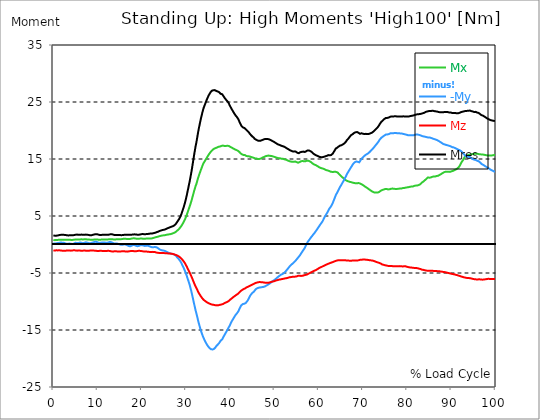
| Category |  Mx |  -My |  Mz |  Mres |
|---|---|---|---|---|
| 0.0 | 0.784 | 0.212 | -1.081 | 1.59 |
| 0.167348456675344 | 0.763 | 0.191 | -1.06 | 1.568 |
| 0.334696913350688 | 0.763 | 0.17 | -1.06 | 1.547 |
| 0.5020453700260321 | 0.763 | 0.191 | -1.038 | 1.547 |
| 0.669393826701376 | 0.784 | 0.212 | -1.017 | 1.547 |
| 0.83674228337672 | 0.805 | 0.254 | -1.017 | 1.568 |
| 1.0040907400520642 | 0.805 | 0.254 | -1.038 | 1.59 |
| 1.1621420602454444 | 0.827 | 0.254 | -1.017 | 1.611 |
| 1.3294905169207885 | 0.848 | 0.297 | -1.017 | 1.653 |
| 1.4968389735961325 | 0.848 | 0.318 | -1.038 | 1.674 |
| 1.6641874302714765 | 0.848 | 0.36 | -1.06 | 1.695 |
| 1.8315358869468206 | 0.848 | 0.339 | -1.081 | 1.717 |
| 1.9988843436221646 | 0.848 | 0.318 | -1.081 | 1.717 |
| 2.1662328002975086 | 0.848 | 0.318 | -1.081 | 1.717 |
| 2.333581256972853 | 0.848 | 0.318 | -1.081 | 1.695 |
| 2.5009297136481967 | 0.848 | 0.276 | -1.102 | 1.695 |
| 2.6682781703235405 | 0.827 | 0.212 | -1.102 | 1.674 |
| 2.8356266269988843 | 0.827 | 0.148 | -1.081 | 1.653 |
| 3.002975083674229 | 0.827 | 0.127 | -1.06 | 1.632 |
| 3.1703235403495724 | 0.827 | 0.127 | -1.038 | 1.611 |
| 3.337671997024917 | 0.827 | 0.148 | -1.038 | 1.59 |
| 3.4957233172182973 | 0.827 | 0.148 | -1.038 | 1.611 |
| 3.663071773893641 | 0.827 | 0.17 | -1.06 | 1.611 |
| 3.8304202305689854 | 0.827 | 0.148 | -1.081 | 1.632 |
| 3.997768687244329 | 0.805 | 0.127 | -1.081 | 1.632 |
| 4.165117143919673 | 0.805 | 0.085 | -1.06 | 1.632 |
| 4.332465600595017 | 0.805 | 0.085 | -1.038 | 1.611 |
| 4.499814057270361 | 0.827 | 0.106 | -1.017 | 1.632 |
| 4.667162513945706 | 0.848 | 0.17 | -1.017 | 1.653 |
| 4.834510970621049 | 0.869 | 0.254 | -1.017 | 1.695 |
| 5.001859427296393 | 0.869 | 0.297 | -1.038 | 1.717 |
| 5.169207883971737 | 0.869 | 0.297 | -1.06 | 1.738 |
| 5.336556340647081 | 0.869 | 0.276 | -1.081 | 1.738 |
| 5.503904797322425 | 0.869 | 0.276 | -1.081 | 1.738 |
| 5.671253253997769 | 0.869 | 0.254 | -1.06 | 1.717 |
| 5.82930457419115 | 0.869 | 0.276 | -1.06 | 1.695 |
| 5.996653030866494 | 0.89 | 0.339 | -1.06 | 1.717 |
| 6.164001487541838 | 0.911 | 0.36 | -1.081 | 1.738 |
| 6.331349944217181 | 0.911 | 0.318 | -1.102 | 1.738 |
| 6.498698400892526 | 0.89 | 0.254 | -1.102 | 1.717 |
| 6.66604685756787 | 0.89 | 0.233 | -1.081 | 1.695 |
| 6.833395314243213 | 0.89 | 0.254 | -1.06 | 1.695 |
| 7.000743770918558 | 0.911 | 0.297 | -1.06 | 1.695 |
| 7.168092227593902 | 0.911 | 0.36 | -1.06 | 1.717 |
| 7.335440684269246 | 0.911 | 0.381 | -1.081 | 1.738 |
| 7.50278914094459 | 0.911 | 0.381 | -1.102 | 1.738 |
| 7.6701375976199335 | 0.89 | 0.318 | -1.102 | 1.717 |
| 7.837486054295278 | 0.89 | 0.276 | -1.102 | 1.674 |
| 7.995537374488658 | 0.869 | 0.254 | -1.102 | 1.674 |
| 8.162885831164003 | 0.848 | 0.233 | -1.081 | 1.632 |
| 8.330234287839346 | 0.848 | 0.212 | -1.06 | 1.611 |
| 8.49758274451469 | 0.848 | 0.254 | -1.06 | 1.632 |
| 8.664931201190035 | 0.848 | 0.297 | -1.038 | 1.632 |
| 8.832279657865378 | 0.848 | 0.318 | -1.06 | 1.674 |
| 8.999628114540721 | 0.848 | 0.36 | -1.06 | 1.717 |
| 9.166976571216066 | 0.869 | 0.424 | -1.06 | 1.738 |
| 9.334325027891412 | 0.869 | 0.466 | -1.081 | 1.78 |
| 9.501673484566755 | 0.869 | 0.466 | -1.102 | 1.801 |
| 9.669021941242098 | 0.89 | 0.466 | -1.102 | 1.801 |
| 9.836370397917442 | 0.89 | 0.445 | -1.123 | 1.801 |
| 10.003718854592787 | 0.869 | 0.381 | -1.144 | 1.78 |
| 10.17106731126813 | 0.848 | 0.318 | -1.123 | 1.738 |
| 10.329118631461512 | 0.827 | 0.276 | -1.123 | 1.695 |
| 10.496467088136853 | 0.827 | 0.276 | -1.102 | 1.674 |
| 10.663815544812199 | 0.848 | 0.297 | -1.102 | 1.653 |
| 10.831164001487544 | 0.848 | 0.318 | -1.102 | 1.674 |
| 10.998512458162887 | 0.869 | 0.36 | -1.123 | 1.695 |
| 11.16586091483823 | 0.869 | 0.36 | -1.123 | 1.717 |
| 11.333209371513574 | 0.869 | 0.36 | -1.144 | 1.717 |
| 11.50055782818892 | 0.89 | 0.339 | -1.144 | 1.717 |
| 11.667906284864264 | 0.89 | 0.339 | -1.144 | 1.717 |
| 11.835254741539607 | 0.89 | 0.318 | -1.144 | 1.717 |
| 12.00260319821495 | 0.869 | 0.297 | -1.144 | 1.695 |
| 12.169951654890292 | 0.869 | 0.297 | -1.123 | 1.695 |
| 12.337300111565641 | 0.89 | 0.339 | -1.102 | 1.695 |
| 12.504648568240984 | 0.911 | 0.381 | -1.123 | 1.738 |
| 12.662699888434362 | 0.933 | 0.424 | -1.123 | 1.759 |
| 12.830048345109708 | 0.933 | 0.445 | -1.166 | 1.78 |
| 12.997396801785053 | 0.933 | 0.424 | -1.187 | 1.801 |
| 13.164745258460396 | 0.933 | 0.381 | -1.208 | 1.801 |
| 13.33209371513574 | 0.911 | 0.318 | -1.229 | 1.78 |
| 13.499442171811083 | 0.89 | 0.233 | -1.229 | 1.738 |
| 13.666790628486426 | 0.89 | 0.191 | -1.208 | 1.695 |
| 13.834139085161771 | 0.89 | 0.191 | -1.208 | 1.674 |
| 14.001487541837117 | 0.89 | 0.191 | -1.187 | 1.653 |
| 14.16883599851246 | 0.911 | 0.191 | -1.208 | 1.653 |
| 14.336184455187803 | 0.911 | 0.191 | -1.208 | 1.674 |
| 14.503532911863147 | 0.933 | 0.148 | -1.229 | 1.674 |
| 14.670881368538492 | 0.933 | 0.106 | -1.229 | 1.674 |
| 14.828932688731873 | 0.933 | 0.064 | -1.229 | 1.674 |
| 14.996281145407215 | 0.933 | 0.021 | -1.25 | 1.674 |
| 15.163629602082558 | 0.933 | -0.021 | -1.229 | 1.653 |
| 15.330978058757903 | 0.933 | -0.064 | -1.208 | 1.632 |
| 15.498326515433247 | 0.954 | -0.064 | -1.187 | 1.632 |
| 15.665674972108594 | 0.975 | -0.042 | -1.166 | 1.653 |
| 15.833023428783937 | 0.996 | 0 | -1.166 | 1.674 |
| 16.00037188545928 | 1.017 | 0.042 | -1.187 | 1.695 |
| 16.167720342134626 | 0.996 | 0.021 | -1.208 | 1.717 |
| 16.335068798809967 | 0.996 | -0.021 | -1.229 | 1.717 |
| 16.502417255485312 | 0.975 | -0.085 | -1.229 | 1.717 |
| 16.669765712160658 | 0.975 | -0.106 | -1.25 | 1.717 |
| 16.837114168836 | 0.975 | -0.191 | -1.229 | 1.717 |
| 17.004462625511344 | 0.975 | -0.254 | -1.208 | 1.695 |
| 17.16251394570472 | 0.975 | -0.297 | -1.187 | 1.695 |
| 17.32986240238007 | 0.975 | -0.318 | -1.166 | 1.695 |
| 17.497210859055414 | 0.996 | -0.276 | -1.144 | 1.695 |
| 17.664559315730756 | 1.038 | -0.212 | -1.144 | 1.717 |
| 17.8319077724061 | 1.06 | -0.148 | -1.144 | 1.738 |
| 17.999256229081443 | 1.081 | -0.085 | -1.144 | 1.759 |
| 18.166604685756788 | 1.081 | -0.085 | -1.166 | 1.759 |
| 18.333953142432133 | 1.081 | -0.106 | -1.187 | 1.78 |
| 18.501301599107478 | 1.06 | -0.148 | -1.187 | 1.78 |
| 18.668650055782823 | 1.038 | -0.212 | -1.187 | 1.759 |
| 18.835998512458165 | 1.017 | -0.254 | -1.166 | 1.738 |
| 19.00334696913351 | 0.996 | -0.297 | -1.144 | 1.717 |
| 19.170695425808855 | 0.996 | -0.297 | -1.102 | 1.717 |
| 19.338043882484197 | 1.017 | -0.254 | -1.102 | 1.717 |
| 19.496095202677576 | 1.017 | -0.191 | -1.102 | 1.738 |
| 19.66344365935292 | 1.038 | -0.127 | -1.123 | 1.759 |
| 19.830792116028263 | 1.038 | -0.085 | -1.144 | 1.78 |
| 19.998140572703612 | 1.038 | -0.106 | -1.166 | 1.823 |
| 20.165489029378953 | 1.038 | -0.127 | -1.208 | 1.823 |
| 20.3328374860543 | 1.017 | -0.17 | -1.208 | 1.823 |
| 20.500185942729644 | 1.017 | -0.212 | -1.208 | 1.801 |
| 20.667534399404985 | 1.017 | -0.254 | -1.208 | 1.801 |
| 20.83488285608033 | 1.017 | -0.233 | -1.208 | 1.801 |
| 21.002231312755672 | 1.038 | -0.212 | -1.229 | 1.823 |
| 21.16957976943102 | 1.038 | -0.191 | -1.25 | 1.844 |
| 21.336928226106362 | 1.038 | -0.191 | -1.272 | 1.844 |
| 21.504276682781704 | 1.038 | -0.233 | -1.293 | 1.865 |
| 21.67162513945705 | 1.038 | -0.297 | -1.293 | 1.886 |
| 21.82967645965043 | 1.06 | -0.339 | -1.314 | 1.929 |
| 21.997024916325774 | 1.06 | -0.403 | -1.314 | 1.929 |
| 22.16437337300112 | 1.06 | -0.445 | -1.314 | 1.929 |
| 22.33172182967646 | 1.081 | -0.487 | -1.293 | 1.929 |
| 22.499070286351806 | 1.123 | -0.466 | -1.314 | 1.95 |
| 22.666418743027148 | 1.166 | -0.466 | -1.314 | 1.992 |
| 22.833767199702496 | 1.208 | -0.445 | -1.314 | 2.035 |
| 23.00111565637784 | 1.25 | -0.445 | -1.335 | 2.056 |
| 23.168464113053183 | 1.293 | -0.445 | -1.378 | 2.098 |
| 23.335812569728528 | 1.314 | -0.487 | -1.42 | 2.162 |
| 23.50316102640387 | 1.356 | -0.551 | -1.441 | 2.204 |
| 23.670509483079215 | 1.378 | -0.657 | -1.462 | 2.247 |
| 23.83785793975456 | 1.42 | -0.784 | -1.484 | 2.31 |
| 23.995909259947936 | 1.462 | -0.848 | -1.484 | 2.374 |
| 24.163257716623285 | 1.505 | -0.933 | -1.505 | 2.437 |
| 24.330606173298627 | 1.526 | -0.975 | -1.505 | 2.458 |
| 24.49795462997397 | 1.547 | -0.996 | -1.505 | 2.501 |
| 24.665303086649313 | 1.59 | -1.038 | -1.505 | 2.543 |
| 24.83265154332466 | 1.59 | -1.06 | -1.505 | 2.564 |
| 25.0 | 1.611 | -1.081 | -1.505 | 2.586 |
| 25.167348456675345 | 1.632 | -1.123 | -1.526 | 2.628 |
| 25.334696913350694 | 1.653 | -1.166 | -1.526 | 2.67 |
| 25.502045370026035 | 1.695 | -1.272 | -1.547 | 2.755 |
| 25.669393826701377 | 1.717 | -1.314 | -1.547 | 2.798 |
| 25.836742283376722 | 1.738 | -1.378 | -1.568 | 2.861 |
| 26.004090740052067 | 1.759 | -1.441 | -1.568 | 2.904 |
| 26.17143919672741 | 1.78 | -1.484 | -1.59 | 2.967 |
| 26.329490516920792 | 1.801 | -1.547 | -1.59 | 3.009 |
| 26.49683897359613 | 1.844 | -1.59 | -1.611 | 3.052 |
| 26.66418743027148 | 1.865 | -1.611 | -1.611 | 3.115 |
| 26.831535886946828 | 1.907 | -1.632 | -1.632 | 3.158 |
| 26.998884343622166 | 1.95 | -1.674 | -1.653 | 3.2 |
| 27.166232800297514 | 1.992 | -1.717 | -1.695 | 3.264 |
| 27.333581256972852 | 2.056 | -1.759 | -1.738 | 3.349 |
| 27.5009297136482 | 2.098 | -1.801 | -1.759 | 3.433 |
| 27.668278170323543 | 2.204 | -1.929 | -1.823 | 3.582 |
| 27.835626626998888 | 2.331 | -2.098 | -1.886 | 3.772 |
| 28.002975083674233 | 2.437 | -2.268 | -1.929 | 3.963 |
| 28.170323540349575 | 2.543 | -2.416 | -2.013 | 4.154 |
| 28.33767199702492 | 2.649 | -2.543 | -2.077 | 4.324 |
| 28.50502045370026 | 2.798 | -2.713 | -2.162 | 4.557 |
| 28.663071773893645 | 2.967 | -2.882 | -2.268 | 4.811 |
| 28.830420230568986 | 3.115 | -3.094 | -2.395 | 5.108 |
| 28.99776868724433 | 3.327 | -3.349 | -2.522 | 5.447 |
| 29.165117143919673 | 3.539 | -3.624 | -2.692 | 5.849 |
| 29.33246560059502 | 3.772 | -3.878 | -2.819 | 6.231 |
| 29.499814057270367 | 4.006 | -4.175 | -2.988 | 6.634 |
| 29.66716251394571 | 4.26 | -4.472 | -3.179 | 7.079 |
| 29.834510970621054 | 4.557 | -4.79 | -3.391 | 7.545 |
| 30.00185942729639 | 4.875 | -5.15 | -3.645 | 8.096 |
| 30.169207883971744 | 5.214 | -5.51 | -3.878 | 8.647 |
| 30.33655634064708 | 5.595 | -5.934 | -4.175 | 9.283 |
| 30.50390479732243 | 5.977 | -6.295 | -4.429 | 9.876 |
| 30.671253253997772 | 6.337 | -6.697 | -4.684 | 10.512 |
| 30.829304574191156 | 6.718 | -7.121 | -4.959 | 11.127 |
| 30.996653030866494 | 7.1 | -7.651 | -5.235 | 11.826 |
| 31.164001487541842 | 7.524 | -8.117 | -5.532 | 12.525 |
| 31.331349944217187 | 7.969 | -8.668 | -5.828 | 13.288 |
| 31.498698400892525 | 8.456 | -9.262 | -6.146 | 14.115 |
| 31.666046857567874 | 8.923 | -9.855 | -6.464 | 14.92 |
| 31.833395314243212 | 9.41 | -10.448 | -6.782 | 15.747 |
| 32.00074377091856 | 9.834 | -10.999 | -7.1 | 16.51 |
| 32.1680922275939 | 10.279 | -11.593 | -7.375 | 17.273 |
| 32.33544068426925 | 10.597 | -12.059 | -7.609 | 17.887 |
| 32.50278914094459 | 11.063 | -12.589 | -7.884 | 18.65 |
| 32.670137597619934 | 11.529 | -13.14 | -8.181 | 19.413 |
| 32.83748605429528 | 11.932 | -13.67 | -8.435 | 20.134 |
| 33.004834510970625 | 12.314 | -14.136 | -8.668 | 20.77 |
| 33.162885831164004 | 12.674 | -14.602 | -8.859 | 21.384 |
| 33.33023428783935 | 13.055 | -15.069 | -9.071 | 21.999 |
| 33.497582744514695 | 13.373 | -15.429 | -9.24 | 22.529 |
| 33.664931201190036 | 13.733 | -15.81 | -9.431 | 23.08 |
| 33.83227965786538 | 14.073 | -16.15 | -9.601 | 23.589 |
| 33.99962811454073 | 14.327 | -16.446 | -9.728 | 24.012 |
| 34.16697657121607 | 14.539 | -16.743 | -9.834 | 24.351 |
| 34.33432502789141 | 14.751 | -16.997 | -9.919 | 24.691 |
| 34.50167348456676 | 14.963 | -17.252 | -10.003 | 25.03 |
| 34.6690219412421 | 15.175 | -17.485 | -10.109 | 25.369 |
| 34.83637039791744 | 15.408 | -17.697 | -10.173 | 25.665 |
| 35.00371885459279 | 15.599 | -17.887 | -10.258 | 25.962 |
| 35.17106731126814 | 15.81 | -18.057 | -10.321 | 26.217 |
| 35.338415767943474 | 16.001 | -18.184 | -10.385 | 26.45 |
| 35.49646708813686 | 16.171 | -18.29 | -10.448 | 26.662 |
| 35.6638155448122 | 16.34 | -18.375 | -10.491 | 26.831 |
| 35.831164001487544 | 16.489 | -18.417 | -10.533 | 26.979 |
| 35.998512458162885 | 16.595 | -18.417 | -10.554 | 27.043 |
| 36.165860914838234 | 16.701 | -18.354 | -10.576 | 27.064 |
| 36.333209371513576 | 16.807 | -18.311 | -10.597 | 27.107 |
| 36.50055782818892 | 16.87 | -18.205 | -10.597 | 27.085 |
| 36.667906284864266 | 16.913 | -18.036 | -10.66 | 27.022 |
| 36.83525474153961 | 16.955 | -17.824 | -10.682 | 26.937 |
| 37.002603198214956 | 17.018 | -17.675 | -10.682 | 26.874 |
| 37.1699516548903 | 17.082 | -17.57 | -10.682 | 26.852 |
| 37.337300111565646 | 17.146 | -17.421 | -10.66 | 26.789 |
| 37.50464856824098 | 17.188 | -17.273 | -10.639 | 26.704 |
| 37.66269988843437 | 17.188 | -17.061 | -10.576 | 26.534 |
| 37.83004834510971 | 17.23 | -16.87 | -10.533 | 26.428 |
| 37.99739680178505 | 17.294 | -16.743 | -10.533 | 26.407 |
| 38.16474525846039 | 17.358 | -16.637 | -10.491 | 26.365 |
| 38.33209371513574 | 17.358 | -16.467 | -10.448 | 26.238 |
| 38.49944217181109 | 17.315 | -16.15 | -10.364 | 25.983 |
| 38.666790628486424 | 17.294 | -15.916 | -10.3 | 25.793 |
| 38.83413908516178 | 17.294 | -15.683 | -10.237 | 25.602 |
| 39.001487541837115 | 17.294 | -15.45 | -10.173 | 25.432 |
| 39.16883599851246 | 17.315 | -15.238 | -10.109 | 25.284 |
| 39.336184455187805 | 17.315 | -15.005 | -10.067 | 25.136 |
| 39.503532911863154 | 17.336 | -14.772 | -10.003 | 24.987 |
| 39.670881368538495 | 17.294 | -14.518 | -9.897 | 24.754 |
| 39.83822982521384 | 17.188 | -14.285 | -9.77 | 24.479 |
| 39.996281145407224 | 17.124 | -14.009 | -9.664 | 24.224 |
| 40.163629602082565 | 17.061 | -13.712 | -9.558 | 23.97 |
| 40.33097805875791 | 16.997 | -13.479 | -9.452 | 23.737 |
| 40.498326515433256 | 16.934 | -13.246 | -9.346 | 23.525 |
| 40.6656749721086 | 16.849 | -13.034 | -9.24 | 23.292 |
| 40.83302342878393 | 16.785 | -12.822 | -9.156 | 23.08 |
| 41.00037188545929 | 16.701 | -12.61 | -9.05 | 22.868 |
| 41.16772034213463 | 16.637 | -12.398 | -8.965 | 22.677 |
| 41.33506879880997 | 16.595 | -12.229 | -8.859 | 22.508 |
| 41.50241725548531 | 16.531 | -12.08 | -8.774 | 22.359 |
| 41.66976571216066 | 16.467 | -11.932 | -8.689 | 22.19 |
| 41.837114168836 | 16.404 | -11.72 | -8.583 | 21.978 |
| 42.004462625511344 | 16.277 | -11.402 | -8.456 | 21.66 |
| 42.17181108218669 | 16.15 | -11.127 | -8.308 | 21.363 |
| 42.32986240238007 | 16.001 | -10.894 | -8.181 | 21.088 |
| 42.497210859055414 | 15.874 | -10.66 | -8.054 | 20.833 |
| 42.66455931573076 | 15.81 | -10.576 | -7.99 | 20.727 |
| 42.831907772406105 | 15.726 | -10.448 | -7.884 | 20.558 |
| 42.999256229081446 | 15.704 | -10.385 | -7.82 | 20.473 |
| 43.16660468575679 | 15.704 | -10.385 | -7.757 | 20.452 |
| 43.33395314243214 | 15.683 | -10.364 | -7.714 | 20.409 |
| 43.50130159910748 | 15.556 | -10.258 | -7.587 | 20.219 |
| 43.66865005578282 | 15.514 | -10.109 | -7.524 | 20.07 |
| 43.83599851245817 | 15.493 | -9.94 | -7.46 | 19.964 |
| 44.00334696913351 | 15.493 | -9.749 | -7.418 | 19.858 |
| 44.17069542580886 | 15.493 | -9.495 | -7.375 | 19.71 |
| 44.3380438824842 | 15.45 | -9.24 | -7.291 | 19.519 |
| 44.49609520267758 | 15.408 | -8.986 | -7.227 | 19.35 |
| 44.66344365935292 | 15.365 | -8.795 | -7.163 | 19.201 |
| 44.83079211602827 | 15.323 | -8.626 | -7.1 | 19.074 |
| 44.99814057270361 | 15.281 | -8.477 | -7.036 | 18.947 |
| 45.16548902937895 | 15.217 | -8.35 | -6.973 | 18.82 |
| 45.332837486054295 | 15.196 | -8.287 | -6.909 | 18.735 |
| 45.500185942729644 | 15.09 | -8.096 | -6.803 | 18.544 |
| 45.66753439940499 | 15.09 | -7.926 | -6.761 | 18.46 |
| 45.83488285608033 | 15.069 | -7.799 | -6.718 | 18.396 |
| 46.00223131275568 | 15.069 | -7.693 | -6.697 | 18.311 |
| 46.16957976943102 | 15.005 | -7.651 | -6.655 | 18.248 |
| 46.336928226106366 | 14.984 | -7.587 | -6.612 | 18.205 |
| 46.50427668278171 | 15.005 | -7.566 | -6.591 | 18.184 |
| 46.671625139457056 | 15.026 | -7.545 | -6.591 | 18.205 |
| 46.829676459650436 | 15.047 | -7.524 | -6.591 | 18.205 |
| 46.99702491632577 | 15.111 | -7.503 | -6.612 | 18.269 |
| 47.16437337300112 | 15.175 | -7.481 | -6.612 | 18.311 |
| 47.33172182967646 | 15.259 | -7.46 | -6.634 | 18.375 |
| 47.49907028635181 | 15.302 | -7.439 | -6.655 | 18.417 |
| 47.66641874302716 | 15.365 | -7.397 | -6.676 | 18.46 |
| 47.83376719970249 | 15.45 | -7.354 | -6.697 | 18.502 |
| 48.001115656377834 | 15.493 | -7.291 | -6.718 | 18.523 |
| 48.16846411305319 | 15.535 | -7.206 | -6.718 | 18.523 |
| 48.33581256972853 | 15.556 | -7.121 | -6.718 | 18.502 |
| 48.50316102640387 | 15.577 | -7.057 | -6.697 | 18.502 |
| 48.67050948307921 | 15.599 | -6.973 | -6.697 | 18.481 |
| 48.837857939754564 | 15.599 | -6.888 | -6.676 | 18.438 |
| 49.005206396429905 | 15.556 | -6.803 | -6.634 | 18.375 |
| 49.163257716623285 | 15.535 | -6.697 | -6.591 | 18.311 |
| 49.33060617329863 | 15.514 | -6.57 | -6.549 | 18.227 |
| 49.49795462997397 | 15.493 | -6.464 | -6.528 | 18.163 |
| 49.66530308664932 | 15.45 | -6.379 | -6.485 | 18.099 |
| 49.832651543324666 | 15.408 | -6.316 | -6.443 | 18.036 |
| 50.0 | 15.365 | -6.21 | -6.422 | 17.951 |
| 50.16734845667534 | 15.323 | -6.104 | -6.379 | 17.866 |
| 50.33469691335069 | 15.281 | -6.019 | -6.316 | 17.781 |
| 50.50204537002604 | 15.238 | -5.892 | -6.295 | 17.697 |
| 50.66939382670139 | 15.196 | -5.765 | -6.252 | 17.612 |
| 50.836742283376715 | 15.153 | -5.659 | -6.21 | 17.548 |
| 51.00409074005207 | 15.132 | -5.553 | -6.167 | 17.485 |
| 51.17143919672741 | 15.132 | -5.468 | -6.146 | 17.464 |
| 51.32949051692079 | 15.111 | -5.383 | -6.125 | 17.4 |
| 51.496838973596134 | 15.069 | -5.277 | -6.083 | 17.336 |
| 51.66418743027148 | 15.026 | -5.192 | -6.061 | 17.294 |
| 51.831535886946824 | 15.005 | -5.171 | -6.04 | 17.252 |
| 51.99888434362217 | 15.026 | -5.086 | -6.019 | 17.23 |
| 52.16623280029752 | 14.984 | -5.002 | -5.998 | 17.167 |
| 52.33358125697285 | 14.92 | -4.875 | -5.955 | 17.061 |
| 52.5009297136482 | 14.899 | -4.726 | -5.934 | 17.018 |
| 52.668278170323546 | 14.857 | -4.557 | -5.913 | 16.955 |
| 52.835626626998895 | 14.793 | -4.429 | -5.892 | 16.849 |
| 53.00297508367424 | 14.73 | -4.26 | -5.849 | 16.764 |
| 53.17032354034958 | 14.687 | -4.09 | -5.807 | 16.701 |
| 53.33767199702492 | 14.624 | -3.921 | -5.765 | 16.595 |
| 53.50502045370027 | 14.581 | -3.772 | -5.743 | 16.531 |
| 53.663071773893655 | 14.56 | -3.645 | -5.722 | 16.467 |
| 53.83042023056899 | 14.539 | -3.518 | -5.701 | 16.425 |
| 53.99776868724433 | 14.518 | -3.391 | -5.68 | 16.383 |
| 54.16511714391967 | 14.475 | -3.306 | -5.659 | 16.319 |
| 54.33246560059503 | 14.496 | -3.2 | -5.638 | 16.319 |
| 54.49981405727037 | 14.539 | -3.052 | -5.638 | 16.34 |
| 54.667162513945705 | 14.56 | -2.925 | -5.638 | 16.34 |
| 54.834510970621054 | 14.518 | -2.776 | -5.616 | 16.298 |
| 55.0018594272964 | 14.454 | -2.607 | -5.595 | 16.192 |
| 55.169207883971744 | 14.39 | -2.458 | -5.553 | 16.086 |
| 55.336556340647086 | 14.348 | -2.31 | -5.489 | 16.022 |
| 55.50390479732243 | 14.369 | -2.141 | -5.489 | 16.022 |
| 55.671253253997776 | 14.454 | -1.971 | -5.489 | 16.086 |
| 55.83860171067312 | 14.539 | -1.801 | -5.51 | 16.192 |
| 55.9966530308665 | 14.602 | -1.59 | -5.51 | 16.256 |
| 56.16400148754184 | 14.624 | -1.399 | -5.51 | 16.256 |
| 56.33134994421718 | 14.645 | -1.187 | -5.489 | 16.298 |
| 56.498698400892536 | 14.645 | -0.996 | -5.447 | 16.298 |
| 56.66604685756788 | 14.602 | -0.805 | -5.404 | 16.256 |
| 56.83339531424321 | 14.581 | -0.615 | -5.383 | 16.234 |
| 57.00074377091856 | 14.602 | -0.339 | -5.341 | 16.298 |
| 57.16809222759391 | 14.645 | -0.064 | -5.298 | 16.361 |
| 57.33544068426925 | 14.708 | 0.212 | -5.277 | 16.467 |
| 57.5027891409446 | 14.708 | 0.424 | -5.214 | 16.51 |
| 57.670137597619934 | 14.708 | 0.615 | -5.129 | 16.51 |
| 57.83748605429528 | 14.645 | 0.784 | -5.086 | 16.489 |
| 58.004834510970625 | 14.581 | 0.975 | -5.002 | 16.425 |
| 58.16288583116401 | 14.496 | 1.166 | -4.917 | 16.361 |
| 58.330234287839346 | 14.412 | 1.314 | -4.853 | 16.256 |
| 58.497582744514695 | 14.306 | 1.484 | -4.79 | 16.171 |
| 58.66493120119004 | 14.179 | 1.653 | -4.726 | 16.022 |
| 58.832279657865385 | 14.094 | 1.823 | -4.641 | 15.916 |
| 58.999628114540734 | 14.03 | 1.971 | -4.599 | 15.832 |
| 59.16697657121607 | 13.967 | 2.141 | -4.535 | 15.747 |
| 59.33432502789142 | 13.924 | 2.31 | -4.493 | 15.683 |
| 59.50167348456676 | 13.861 | 2.522 | -4.429 | 15.62 |
| 59.66902194124211 | 13.776 | 2.713 | -4.345 | 15.577 |
| 59.83637039791745 | 13.691 | 2.904 | -4.26 | 15.514 |
| 60.00371885459278 | 13.606 | 3.094 | -4.175 | 15.429 |
| 60.17106731126813 | 13.543 | 3.264 | -4.112 | 15.365 |
| 60.33841576794349 | 13.458 | 3.476 | -4.027 | 15.302 |
| 60.49646708813685 | 13.416 | 3.666 | -3.963 | 15.323 |
| 60.6638155448122 | 13.373 | 3.836 | -3.921 | 15.323 |
| 60.831164001487544 | 13.352 | 4.027 | -3.857 | 15.323 |
| 60.99851245816289 | 13.31 | 4.281 | -3.794 | 15.365 |
| 61.16586091483824 | 13.246 | 4.557 | -3.73 | 15.387 |
| 61.333209371513576 | 13.182 | 4.811 | -3.666 | 15.429 |
| 61.50055782818892 | 13.098 | 5.023 | -3.603 | 15.471 |
| 61.667906284864266 | 13.055 | 5.256 | -3.539 | 15.535 |
| 61.835254741539615 | 13.034 | 5.468 | -3.476 | 15.556 |
| 62.002603198214956 | 12.992 | 5.68 | -3.433 | 15.599 |
| 62.16995165489029 | 12.949 | 5.955 | -3.391 | 15.683 |
| 62.33730011156564 | 12.907 | 6.21 | -3.327 | 15.726 |
| 62.504648568240995 | 12.801 | 6.379 | -3.264 | 15.641 |
| 62.67199702491633 | 12.78 | 6.57 | -3.221 | 15.662 |
| 62.83004834510971 | 12.737 | 6.761 | -3.179 | 15.704 |
| 62.99739680178505 | 12.737 | 7.015 | -3.137 | 15.81 |
| 63.1647452584604 | 12.716 | 7.291 | -3.073 | 15.938 |
| 63.33209371513575 | 12.737 | 7.609 | -3.031 | 16.15 |
| 63.4994421718111 | 12.759 | 7.926 | -2.967 | 16.361 |
| 63.666790628486424 | 12.78 | 8.266 | -2.925 | 16.573 |
| 63.83413908516177 | 12.78 | 8.605 | -2.882 | 16.828 |
| 64.00148754183712 | 12.716 | 8.859 | -2.84 | 16.913 |
| 64.16883599851248 | 12.653 | 9.092 | -2.798 | 16.976 |
| 64.3361844551878 | 12.589 | 9.346 | -2.776 | 17.103 |
| 64.50353291186315 | 12.462 | 9.601 | -2.776 | 17.188 |
| 64.6708813685385 | 12.292 | 9.855 | -2.755 | 17.23 |
| 64.83822982521384 | 12.165 | 10.131 | -2.755 | 17.358 |
| 65.00557828188919 | 12.038 | 10.321 | -2.755 | 17.379 |
| 65.16362960208257 | 11.89 | 10.533 | -2.755 | 17.421 |
| 65.3309780587579 | 11.805 | 10.788 | -2.755 | 17.506 |
| 65.49832651543326 | 11.699 | 10.999 | -2.776 | 17.591 |
| 65.6656749721086 | 11.572 | 11.254 | -2.776 | 17.654 |
| 65.83302342878395 | 11.466 | 11.487 | -2.776 | 17.76 |
| 66.00037188545929 | 11.339 | 11.741 | -2.776 | 17.909 |
| 66.16772034213463 | 11.254 | 11.974 | -2.798 | 18.057 |
| 66.33506879880998 | 11.19 | 12.292 | -2.798 | 18.269 |
| 66.50241725548531 | 11.148 | 12.525 | -2.819 | 18.417 |
| 66.66976571216065 | 11.084 | 12.716 | -2.819 | 18.544 |
| 66.83711416883601 | 11.042 | 12.949 | -2.84 | 18.693 |
| 67.00446262551135 | 10.999 | 13.161 | -2.84 | 18.884 |
| 67.1718110821867 | 10.978 | 13.373 | -2.84 | 19.053 |
| 67.32986240238007 | 10.936 | 13.585 | -2.84 | 19.201 |
| 67.49721085905541 | 10.894 | 13.755 | -2.819 | 19.244 |
| 67.66455931573076 | 10.851 | 13.988 | -2.819 | 19.35 |
| 67.83190777240611 | 10.809 | 14.2 | -2.819 | 19.456 |
| 67.99925622908145 | 10.788 | 14.348 | -2.819 | 19.583 |
| 68.16660468575678 | 10.766 | 14.433 | -2.819 | 19.625 |
| 68.33395314243214 | 10.745 | 14.496 | -2.819 | 19.689 |
| 68.50130159910749 | 10.745 | 14.56 | -2.798 | 19.731 |
| 68.66865005578282 | 10.745 | 14.56 | -2.798 | 19.731 |
| 68.83599851245816 | 10.788 | 14.496 | -2.798 | 19.689 |
| 69.00334696913352 | 10.788 | 14.454 | -2.776 | 19.604 |
| 69.17069542580886 | 10.766 | 14.412 | -2.755 | 19.498 |
| 69.3380438824842 | 10.703 | 14.581 | -2.692 | 19.413 |
| 69.50539233915956 | 10.639 | 14.836 | -2.67 | 19.477 |
| 69.66344365935292 | 10.576 | 14.984 | -2.692 | 19.519 |
| 69.83079211602826 | 10.512 | 15.153 | -2.649 | 19.477 |
| 69.99814057270362 | 10.427 | 15.281 | -2.628 | 19.435 |
| 70.16548902937896 | 10.342 | 15.429 | -2.607 | 19.413 |
| 70.33283748605429 | 10.237 | 15.556 | -2.628 | 19.371 |
| 70.50018594272964 | 10.152 | 15.662 | -2.649 | 19.392 |
| 70.667534399405 | 10.067 | 15.768 | -2.67 | 19.413 |
| 70.83488285608033 | 9.982 | 15.832 | -2.692 | 19.392 |
| 71.00223131275568 | 9.897 | 15.916 | -2.692 | 19.371 |
| 71.16957976943102 | 9.813 | 15.98 | -2.713 | 19.371 |
| 71.33692822610637 | 9.707 | 16.065 | -2.734 | 19.392 |
| 71.50427668278171 | 9.601 | 16.213 | -2.755 | 19.435 |
| 71.67162513945706 | 9.516 | 16.361 | -2.776 | 19.498 |
| 71.8389735961324 | 9.431 | 16.489 | -2.776 | 19.541 |
| 71.99702491632577 | 9.346 | 16.616 | -2.798 | 19.604 |
| 72.16437337300113 | 9.262 | 16.743 | -2.84 | 19.689 |
| 72.33172182967647 | 9.198 | 16.913 | -2.861 | 19.795 |
| 72.49907028635181 | 9.156 | 17.061 | -2.904 | 19.901 |
| 72.66641874302715 | 9.113 | 17.209 | -2.946 | 20.028 |
| 72.8337671997025 | 9.092 | 17.379 | -2.988 | 20.155 |
| 73.00111565637783 | 9.113 | 17.548 | -3.052 | 20.304 |
| 73.16846411305319 | 9.113 | 17.697 | -3.094 | 20.431 |
| 73.33581256972853 | 9.113 | 17.845 | -3.137 | 20.558 |
| 73.50316102640387 | 9.156 | 18.036 | -3.158 | 20.749 |
| 73.67050948307921 | 9.219 | 18.248 | -3.221 | 20.939 |
| 73.83785793975457 | 9.346 | 18.438 | -3.306 | 21.172 |
| 74.00520639642991 | 9.41 | 18.587 | -3.327 | 21.342 |
| 74.16325771662328 | 9.495 | 18.735 | -3.433 | 21.533 |
| 74.33060617329863 | 9.558 | 18.841 | -3.497 | 21.681 |
| 74.49795462997398 | 9.58 | 18.926 | -3.539 | 21.766 |
| 74.66530308664932 | 9.643 | 19.032 | -3.561 | 21.914 |
| 74.83265154332466 | 9.707 | 19.117 | -3.603 | 22.02 |
| 75.00000000000001 | 9.728 | 19.18 | -3.645 | 22.084 |
| 75.16734845667534 | 9.749 | 19.286 | -3.666 | 22.19 |
| 75.3346969133507 | 9.749 | 19.307 | -3.688 | 22.211 |
| 75.50204537002605 | 9.685 | 19.307 | -3.73 | 22.211 |
| 75.66939382670138 | 9.664 | 19.329 | -3.751 | 22.211 |
| 75.83674228337672 | 9.685 | 19.371 | -3.772 | 22.275 |
| 76.00409074005208 | 9.685 | 19.435 | -3.794 | 22.338 |
| 76.17143919672742 | 9.728 | 19.498 | -3.794 | 22.423 |
| 76.33878765340276 | 9.77 | 19.541 | -3.794 | 22.465 |
| 76.49683897359614 | 9.791 | 19.519 | -3.794 | 22.465 |
| 76.66418743027148 | 9.813 | 19.498 | -3.794 | 22.465 |
| 76.83153588694682 | 9.791 | 19.519 | -3.815 | 22.465 |
| 76.99888434362218 | 9.77 | 19.541 | -3.836 | 22.486 |
| 77.16623280029752 | 9.77 | 19.562 | -3.836 | 22.486 |
| 77.33358125697285 | 9.749 | 19.562 | -3.836 | 22.486 |
| 77.5009297136482 | 9.749 | 19.562 | -3.836 | 22.486 |
| 77.66827817032356 | 9.749 | 19.519 | -3.836 | 22.465 |
| 77.83562662699889 | 9.77 | 19.498 | -3.815 | 22.444 |
| 78.00297508367423 | 9.77 | 19.498 | -3.815 | 22.465 |
| 78.17032354034959 | 9.791 | 19.519 | -3.815 | 22.465 |
| 78.33767199702493 | 9.813 | 19.477 | -3.794 | 22.465 |
| 78.50502045370027 | 9.813 | 19.477 | -3.794 | 22.444 |
| 78.67236891037561 | 9.813 | 19.477 | -3.815 | 22.465 |
| 78.83042023056899 | 9.834 | 19.456 | -3.836 | 22.465 |
| 78.99776868724433 | 9.897 | 19.435 | -3.857 | 22.486 |
| 79.16511714391969 | 9.919 | 19.392 | -3.878 | 22.486 |
| 79.33246560059503 | 9.919 | 19.371 | -3.815 | 22.444 |
| 79.49981405727036 | 9.94 | 19.329 | -3.815 | 22.444 |
| 79.66716251394571 | 9.982 | 19.286 | -3.836 | 22.444 |
| 79.83451097062107 | 10.003 | 19.265 | -3.878 | 22.465 |
| 80.00185942729641 | 10.025 | 19.223 | -3.921 | 22.465 |
| 80.16920788397174 | 10.046 | 19.18 | -3.963 | 22.444 |
| 80.33655634064709 | 10.067 | 19.159 | -3.984 | 22.465 |
| 80.50390479732243 | 10.067 | 19.159 | -3.984 | 22.486 |
| 80.67125325399778 | 10.131 | 19.159 | -4.027 | 22.508 |
| 80.83860171067312 | 10.152 | 19.18 | -4.048 | 22.55 |
| 80.99665303086651 | 10.173 | 19.201 | -4.048 | 22.592 |
| 81.16400148754184 | 10.173 | 19.18 | -4.069 | 22.592 |
| 81.3313499442172 | 10.194 | 19.18 | -4.09 | 22.614 |
| 81.49869840089255 | 10.258 | 19.18 | -4.112 | 22.656 |
| 81.66604685756786 | 10.3 | 19.223 | -4.112 | 22.72 |
| 81.83339531424322 | 10.321 | 19.265 | -4.133 | 22.762 |
| 82.00074377091858 | 10.342 | 19.286 | -4.133 | 22.804 |
| 82.16809222759392 | 10.342 | 19.307 | -4.133 | 22.826 |
| 82.33544068426926 | 10.364 | 19.286 | -4.154 | 22.826 |
| 82.50278914094459 | 10.406 | 19.265 | -4.196 | 22.847 |
| 82.67013759761994 | 10.448 | 19.244 | -4.239 | 22.889 |
| 82.83748605429528 | 10.533 | 19.201 | -4.281 | 22.889 |
| 83.00483451097062 | 10.597 | 19.159 | -4.302 | 22.889 |
| 83.17218296764597 | 10.724 | 19.095 | -4.345 | 22.932 |
| 83.33023428783935 | 10.872 | 19.032 | -4.408 | 22.974 |
| 83.4975827445147 | 10.957 | 18.989 | -4.429 | 23.016 |
| 83.66493120119004 | 11.042 | 19.011 | -4.451 | 23.101 |
| 83.83227965786537 | 11.105 | 18.947 | -4.493 | 23.101 |
| 83.99962811454073 | 11.275 | 18.905 | -4.514 | 23.165 |
| 84.16697657121607 | 11.402 | 18.884 | -4.535 | 23.249 |
| 84.33432502789142 | 11.508 | 18.862 | -4.578 | 23.292 |
| 84.50167348456677 | 11.635 | 18.82 | -4.599 | 23.334 |
| 84.6690219412421 | 11.762 | 18.778 | -4.599 | 23.398 |
| 84.83637039791745 | 11.762 | 18.756 | -4.599 | 23.398 |
| 85.0037188545928 | 11.72 | 18.756 | -4.599 | 23.398 |
| 85.17106731126813 | 11.72 | 18.756 | -4.599 | 23.419 |
| 85.33841576794349 | 11.762 | 18.735 | -4.599 | 23.44 |
| 85.50576422461883 | 11.805 | 18.672 | -4.599 | 23.44 |
| 85.66381554481221 | 11.868 | 18.629 | -4.599 | 23.461 |
| 85.83116400148755 | 11.932 | 18.566 | -4.62 | 23.461 |
| 85.99851245816289 | 11.932 | 18.523 | -4.641 | 23.419 |
| 86.16586091483823 | 11.932 | 18.481 | -4.663 | 23.398 |
| 86.33320937151358 | 11.932 | 18.438 | -4.663 | 23.377 |
| 86.50055782818893 | 11.974 | 18.396 | -4.663 | 23.355 |
| 86.66790628486427 | 12.017 | 18.375 | -4.663 | 23.355 |
| 86.83525474153961 | 12.038 | 18.29 | -4.684 | 23.313 |
| 87.00260319821496 | 12.059 | 18.205 | -4.684 | 23.249 |
| 87.16995165489031 | 12.123 | 18.142 | -4.705 | 23.228 |
| 87.33730011156564 | 12.208 | 18.057 | -4.705 | 23.228 |
| 87.504648568241 | 12.292 | 17.972 | -4.726 | 23.207 |
| 87.67199702491634 | 12.356 | 17.909 | -4.747 | 23.207 |
| 87.83004834510972 | 12.441 | 17.803 | -4.769 | 23.207 |
| 87.99739680178506 | 12.525 | 17.718 | -4.79 | 23.207 |
| 88.1647452584604 | 12.61 | 17.633 | -4.811 | 23.207 |
| 88.33209371513574 | 12.674 | 17.591 | -4.832 | 23.228 |
| 88.49944217181108 | 12.737 | 17.548 | -4.853 | 23.249 |
| 88.66679062848644 | 12.759 | 17.506 | -4.875 | 23.249 |
| 88.83413908516178 | 12.759 | 17.464 | -4.917 | 23.228 |
| 89.00148754183712 | 12.78 | 17.421 | -4.938 | 23.228 |
| 89.16883599851246 | 12.78 | 17.4 | -4.981 | 23.228 |
| 89.33618445518782 | 12.759 | 17.358 | -5.002 | 23.207 |
| 89.50353291186315 | 12.737 | 17.315 | -5.023 | 23.165 |
| 89.6708813685385 | 12.737 | 17.273 | -5.065 | 23.143 |
| 89.83822982521386 | 12.801 | 17.23 | -5.086 | 23.165 |
| 90.00557828188919 | 12.843 | 17.146 | -5.129 | 23.122 |
| 90.16362960208257 | 12.865 | 17.082 | -5.15 | 23.08 |
| 90.3309780587579 | 12.907 | 17.061 | -5.192 | 23.059 |
| 90.49832651543326 | 12.971 | 17.04 | -5.214 | 23.08 |
| 90.66567497210859 | 13.034 | 16.976 | -5.235 | 23.101 |
| 90.83302342878395 | 13.098 | 16.913 | -5.277 | 23.059 |
| 91.00037188545929 | 13.161 | 16.849 | -5.32 | 23.059 |
| 91.16772034213463 | 13.246 | 16.785 | -5.362 | 23.037 |
| 91.33506879880998 | 13.331 | 16.722 | -5.383 | 23.037 |
| 91.50241725548533 | 13.458 | 16.658 | -5.447 | 23.016 |
| 91.66976571216065 | 13.564 | 16.595 | -5.468 | 23.037 |
| 91.83711416883601 | 13.755 | 16.552 | -5.51 | 23.101 |
| 92.00446262551137 | 13.988 | 16.489 | -5.553 | 23.165 |
| 92.1718110821867 | 14.263 | 16.383 | -5.595 | 23.228 |
| 92.33915953886203 | 14.475 | 16.256 | -5.638 | 23.271 |
| 92.49721085905541 | 14.666 | 16.15 | -5.68 | 23.292 |
| 92.66455931573077 | 14.857 | 16.022 | -5.722 | 23.313 |
| 92.83190777240611 | 15.111 | 15.853 | -5.765 | 23.355 |
| 92.99925622908145 | 15.344 | 15.683 | -5.786 | 23.398 |
| 93.1666046857568 | 15.514 | 15.535 | -5.828 | 23.419 |
| 93.33395314243214 | 15.577 | 15.493 | -5.849 | 23.44 |
| 93.50130159910749 | 15.641 | 15.45 | -5.871 | 23.44 |
| 93.66865005578283 | 15.683 | 15.408 | -5.871 | 23.461 |
| 93.83599851245818 | 15.704 | 15.387 | -5.892 | 23.461 |
| 94.00334696913353 | 15.747 | 15.344 | -5.892 | 23.483 |
| 94.17069542580886 | 15.789 | 15.344 | -5.913 | 23.504 |
| 94.3380438824842 | 15.81 | 15.259 | -5.934 | 23.461 |
| 94.50539233915954 | 15.832 | 15.153 | -5.977 | 23.398 |
| 94.66344365935292 | 15.853 | 15.069 | -5.998 | 23.377 |
| 94.83079211602828 | 15.853 | 15.005 | -6.04 | 23.334 |
| 94.99814057270362 | 15.874 | 14.92 | -6.061 | 23.292 |
| 95.16548902937897 | 15.895 | 14.878 | -6.083 | 23.249 |
| 95.33283748605432 | 15.916 | 14.857 | -6.104 | 23.271 |
| 95.50018594272963 | 15.916 | 14.836 | -6.104 | 23.271 |
| 95.66753439940499 | 15.916 | 14.751 | -6.125 | 23.186 |
| 95.83488285608034 | 15.895 | 14.687 | -6.125 | 23.143 |
| 96.00223131275567 | 15.895 | 14.645 | -6.125 | 23.101 |
| 96.16957976943102 | 15.874 | 14.602 | -6.104 | 23.08 |
| 96.33692822610638 | 15.832 | 14.56 | -6.104 | 22.995 |
| 96.50427668278171 | 15.81 | 14.39 | -6.125 | 22.868 |
| 96.67162513945706 | 15.81 | 14.263 | -6.146 | 22.783 |
| 96.8389735961324 | 15.81 | 14.115 | -6.146 | 22.677 |
| 96.99702491632577 | 15.81 | 14.03 | -6.167 | 22.614 |
| 97.16437337300111 | 15.789 | 13.988 | -6.167 | 22.592 |
| 97.33172182967647 | 15.747 | 13.903 | -6.146 | 22.508 |
| 97.49907028635181 | 15.726 | 13.818 | -6.125 | 22.423 |
| 97.66641874302715 | 15.704 | 13.733 | -6.104 | 22.338 |
| 97.8337671997025 | 15.662 | 13.649 | -6.083 | 22.253 |
| 98.00111565637785 | 15.641 | 13.564 | -6.061 | 22.147 |
| 98.16846411305319 | 15.62 | 13.479 | -6.04 | 22.084 |
| 98.33581256972855 | 15.62 | 13.416 | -6.019 | 22.041 |
| 98.50316102640389 | 15.62 | 13.331 | -6.019 | 21.957 |
| 98.67050948307921 | 15.599 | 13.225 | -6.04 | 21.893 |
| 98.83785793975456 | 15.599 | 13.14 | -6.04 | 21.829 |
| 99.0052063964299 | 15.62 | 13.055 | -6.04 | 21.787 |
| 99.17255485310525 | 15.62 | 13.013 | -6.061 | 21.766 |
| 99.33060617329863 | 15.641 | 12.928 | -6.04 | 21.723 |
| 99.49795462997399 | 15.662 | 12.886 | -6.04 | 21.702 |
| 99.66530308664933 | 15.704 | 12.801 | -6.04 | 21.681 |
| 99.83265154332467 | 15.726 | 12.716 | -6.061 | 21.66 |
| 100.0 | 15.768 | 12.631 | -6.083 | 21.639 |